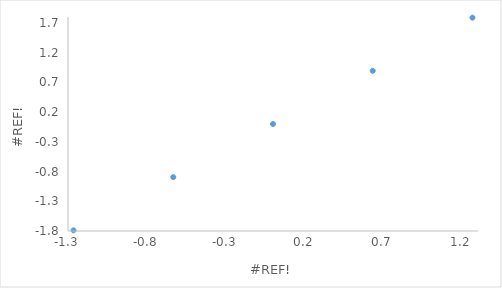
| Category | X2 |
|---|---|
| -1.2649110640673518 | -1.789 |
| -0.6324555320336759 | -0.894 |
| 0.0 | 0 |
| 0.6324555320336759 | 0.894 |
| 1.2649110640673518 | 1.789 |